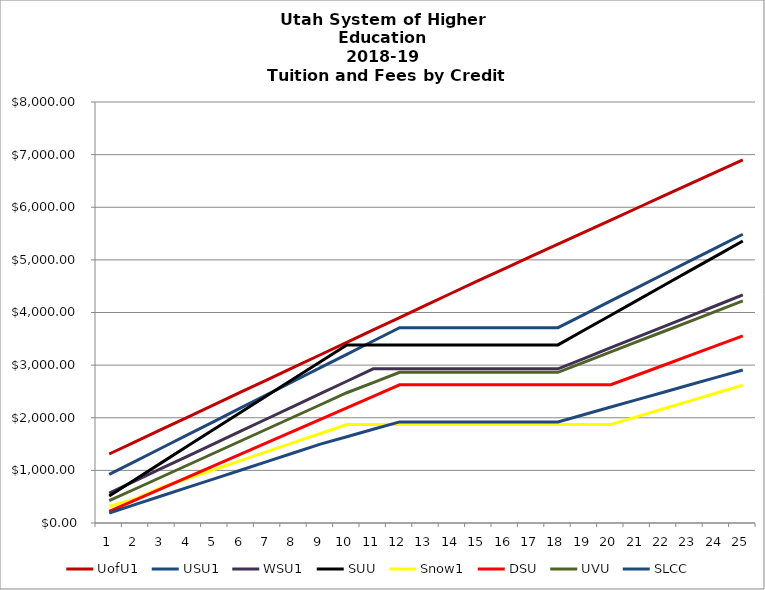
| Category | UofU1 | USU1 | WSU1 | SUU | Snow1 | DSU | UVU | SLCC |
|---|---|---|---|---|---|---|---|---|
| 1.0 | 1311.07 | 923.17 | 569.11 | 513.75 | 313 | 218.92 | 423 | 190.5 |
| 2.0 | 1546.79 | 1176.72 | 805.17 | 832.75 | 463 | 437.79 | 651 | 354 |
| 3.0 | 1782.51 | 1430.27 | 1041.23 | 1151.75 | 681 | 656.66 | 879 | 517.5 |
| 4.0 | 2018.23 | 1683.82 | 1277.29 | 1470.75 | 851 | 875.53 | 1107 | 681 |
| 5.0 | 2253.95 | 1937.37 | 1513.35 | 1789.75 | 1021 | 1094.39 | 1335 | 844.5 |
| 6.0 | 2489.67 | 2190.92 | 1749.41 | 2108.75 | 1191 | 1313.26 | 1563 | 1008 |
| 7.0 | 2725.39 | 2444.47 | 1985.47 | 2427.75 | 1361 | 1532.14 | 1791 | 1171.5 |
| 8.0 | 2961.11 | 2698.02 | 2221.53 | 2746.75 | 1531 | 1751.01 | 2019 | 1335 |
| 9.0 | 3196.83 | 2951.57 | 2457.59 | 3065.75 | 1701 | 1969.89 | 2247 | 1498.5 |
| 10.0 | 3432.55 | 3205.12 | 2693.65 | 3384.75 | 1871 | 2188.76 | 2475 | 1639.5 |
| 11.0 | 3668.27 | 3458.67 | 2929.71 | 3384.75 | 1871 | 2407.63 | 2669 | 1780.5 |
| 12.0 | 3903.99 | 3712.22 | 2929.71 | 3384.75 | 1871 | 2626.5 | 2863 | 1921.5 |
| 13.0 | 4139.71 | 3712.22 | 2929.71 | 3384.75 | 1871 | 2626.5 | 2863 | 1921.5 |
| 14.0 | 4375.43 | 3712.22 | 2929.71 | 3384.75 | 1871 | 2626.5 | 2863 | 1921.5 |
| 15.0 | 4611.15 | 3712.22 | 2929.71 | 3384.75 | 1871 | 2626.5 | 2863 | 1921.5 |
| 16.0 | 4840.22 | 3712.22 | 2929.71 | 3384.75 | 1871 | 2626.5 | 2863 | 1921.5 |
| 17.0 | 5069.29 | 3712.22 | 2929.71 | 3384.75 | 1871 | 2626.5 | 2863 | 1921.5 |
| 18.0 | 5298.36 | 3712.22 | 2929.71 | 3384.75 | 1871 | 2626.5 | 2863 | 1921.5 |
| 19.0 | 5527.43 | 3965.77 | 3130.28 | 3666.75 | 1871 | 2626.5 | 3057 | 2062.5 |
| 20.0 | 5756.5 | 4219.32 | 3330.85 | 3948.75 | 1871 | 2626.5 | 3251 | 2203.5 |
| 21.0 | 5985.57 | 4472.87 | 3531.42 | 4230.75 | 2021 | 2812.25 | 3445 | 2344.5 |
| 22.0 | 6214.64 | 4726.42 | 3731.99 | 4512.75 | 2171 | 2998 | 3639 | 2485.5 |
| 23.0 | 6443.71 | 4979.97 | 3932.56 | 4794.75 | 2321 | 3183.75 | 3833 | 2626.5 |
| 24.0 | 6672.78 | 5233.52 | 4133.13 | 5076.75 | 2471 | 3369.5 | 4027 | 2767.5 |
| 25.0 | 6901.85 | 5487.07 | 4333.7 | 5358.75 | 2621 | 3555.25 | 4221 | 2908.5 |